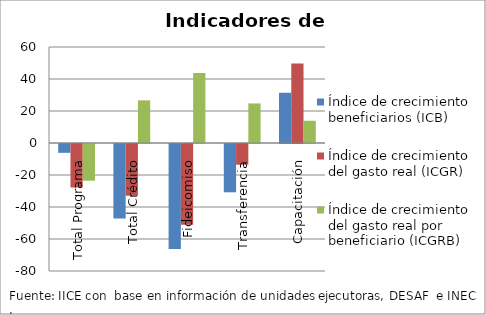
| Category | Índice de crecimiento beneficiarios (ICB)  | Índice de crecimiento del gasto real (ICGR)  | Índice de crecimiento del gasto real por beneficiario (ICGRB)  |
|---|---|---|---|
| Total Programa | -5.524 | -27.192 | -22.935 |
| Total Crédito | -46.569 | -32.335 | 26.64 |
| Fideicomiso | -65.556 | -50.503 | 43.701 |
| Transferencia | -30.192 | -12.925 | 24.735 |
| Capacitación | 31.404 | 49.677 | 13.906 |